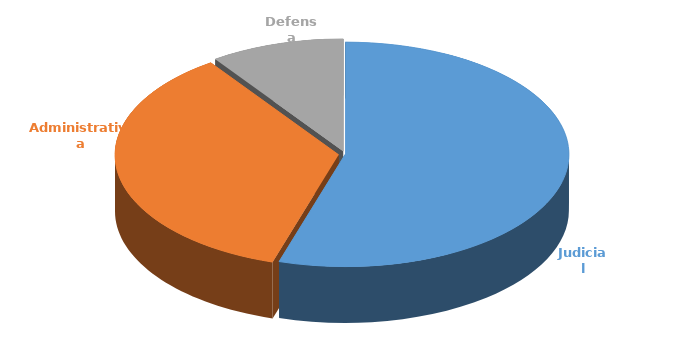
| Category | Cantidad |
|---|---|
| Judicial | 373 |
| Administrativa | 242 |
| Defensa | 66 |